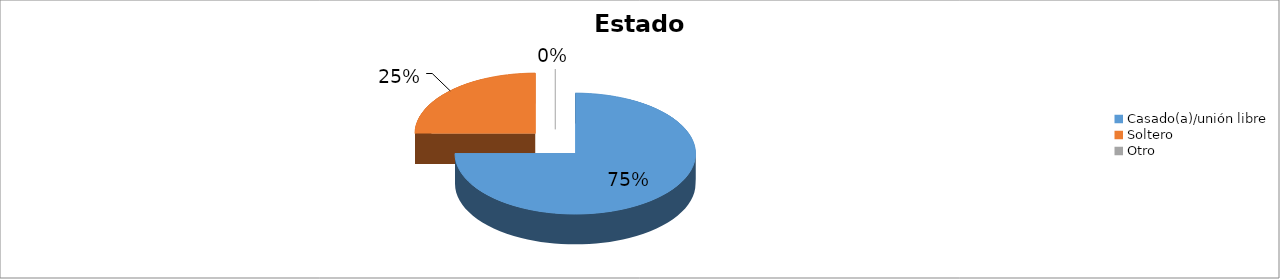
| Category | Series 0 |
|---|---|
| Casado(a)/unión libre | 0.75 |
| Soltero | 0.25 |
| Otro | 0 |